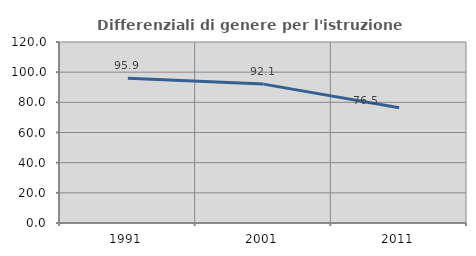
| Category | Differenziali di genere per l'istruzione superiore |
|---|---|
| 1991.0 | 95.927 |
| 2001.0 | 92.073 |
| 2011.0 | 76.471 |